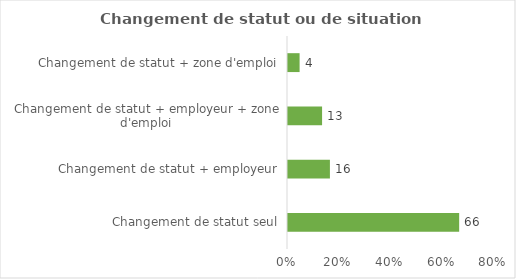
| Category | Series 0 |
|---|---|
| Changement de statut seul | 66.153 |
| Changement de statut + employeur | 16.198 |
| Changement de statut + employeur + zone d'emploi | 13.169 |
| Changement de statut + zone d'emploi | 4.48 |